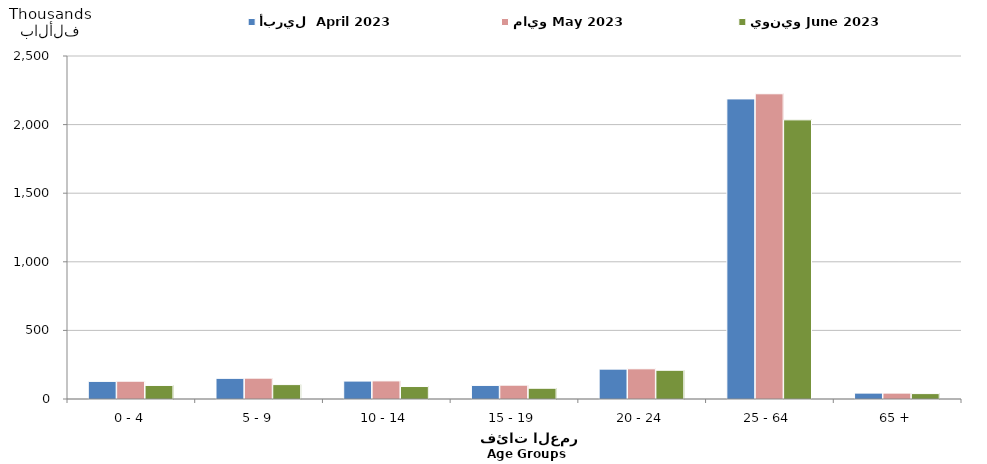
| Category | أبريل  April 2023 | مايو May 2023  | يونيو June 2023  |
|---|---|---|---|
| 0 - 4 | 128239 | 129680 | 98640 |
| 5 - 9 | 150455 | 151917 | 104929 |
| 10 - 14 | 130730 | 131959 | 90947 |
| 15 - 19 | 98940 | 100736 | 78296 |
| 20 - 24 | 217626 | 219940 | 209367 |
| 25 - 64 | 2187248 | 2224590 | 2034520 |
| 65 + | 43023 | 42959 | 39333 |